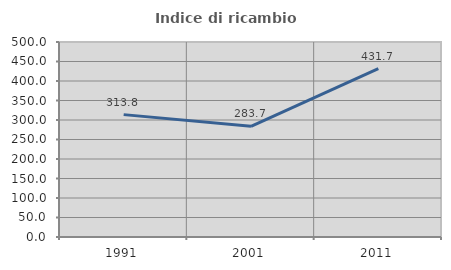
| Category | Indice di ricambio occupazionale  |
|---|---|
| 1991.0 | 313.793 |
| 2001.0 | 283.721 |
| 2011.0 | 431.707 |